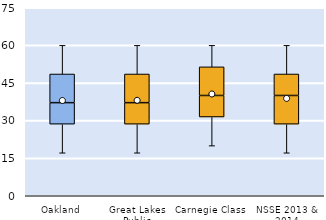
| Category | 25th | 50th | 75th |
|---|---|---|---|
| Oakland | 28.571 | 8.571 | 11.429 |
| Great Lakes Public | 28.571 | 8.571 | 11.429 |
| Carnegie Class | 31.429 | 8.571 | 11.429 |
| NSSE 2013 & 2014 | 28.571 | 11.429 | 8.571 |